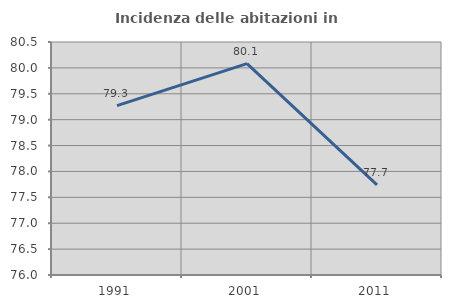
| Category | Incidenza delle abitazioni in proprietà  |
|---|---|
| 1991.0 | 79.272 |
| 2001.0 | 80.081 |
| 2011.0 | 77.739 |